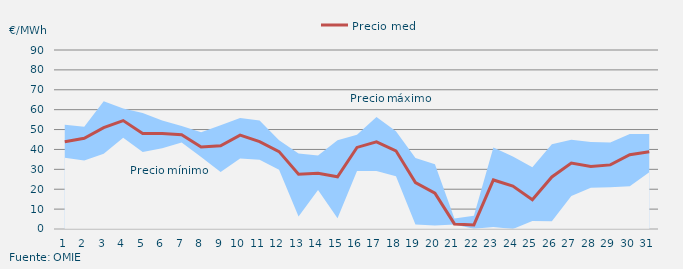
| Category | Precio medio |
|---|---|
| 1 | 43.918 |
| 2 | 45.632 |
| 3 | 50.981 |
| 4 | 54.509 |
| 5 | 48.041 |
| 6 | 47.957 |
| 7 | 47.433 |
| 8 | 41.204 |
| 9 | 41.864 |
| 10 | 47.23 |
| 11 | 43.911 |
| 12 | 38.918 |
| 13 | 27.511 |
| 14 | 27.994 |
| 15 | 26.252 |
| 16 | 41.014 |
| 17 | 43.808 |
| 18 | 39.304 |
| 19 | 23.304 |
| 20 | 18.019 |
| 21 | 2.554 |
| 22 | 2.043 |
| 23 | 24.661 |
| 24 | 21.619 |
| 25 | 14.729 |
| 26 | 26.154 |
| 27 | 33.197 |
| 28 | 31.388 |
| 29 | 32.232 |
| 30 | 37.343 |
| 31 | 38.846 |